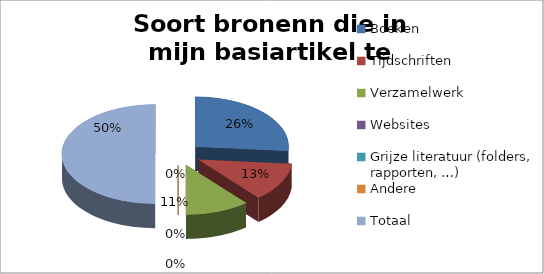
| Category | Procent |
|---|---|
| Boeken | 0.528 |
| Tijdschriften | 0.25 |
| Verzamelwerk | 0.222 |
| Websites | 0 |
| Grijze literatuur (folders, rapporten, …) | 0 |
| Andere | 0 |
| Totaal | 1 |